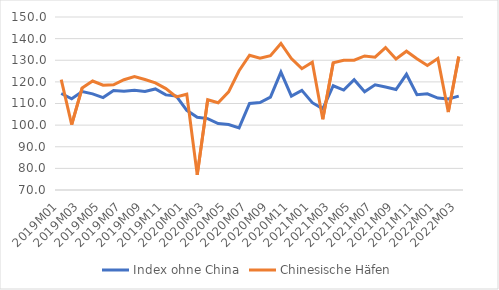
| Category | Index ohne China | Chinesische Häfen |
|---|---|---|
| 2019M01 | 114.623 | 121.055 |
| 2019M02 | 112.167 | 100.243 |
| 2019M03 | 115.491 | 117.222 |
| 2019M04 | 114.471 | 120.395 |
| 2019M05 | 112.755 | 118.453 |
| 2019M06 | 115.991 | 118.615 |
| 2019M07 | 115.713 | 120.972 |
| 2019M08 | 116.136 | 122.456 |
| 2019M09 | 115.568 | 121.083 |
| 2019M10 | 116.723 | 119.525 |
| 2019M11 | 113.984 | 116.902 |
| 2019M12 | 113.424 | 113.065 |
| 2020M01 | 106.849 | 114.303 |
| 2020M02 | 103.623 | 76.996 |
| 2020M03 | 103.019 | 111.745 |
| 2020M04 | 100.709 | 110.345 |
| 2020M05 | 100.278 | 115.373 |
| 2020M06 | 98.733 | 125.162 |
| 2020M07 | 110.053 | 132.331 |
| 2020M08 | 110.414 | 130.985 |
| 2020M09 | 112.922 | 132.092 |
| 2020M10 | 124.506 | 137.768 |
| 2020M11 | 113.407 | 130.804 |
| 2020M12 | 116.079 | 126.094 |
| 2021M01 | 110.373 | 129.138 |
| 2021M02 | 107.516 | 102.714 |
| 2021M03 | 118.214 | 128.817 |
| 2021M04 | 116.222 | 130.006 |
| 2021M05 | 120.982 | 130.043 |
| 2021M06 | 115.458 | 131.997 |
| 2021M07 | 118.653 | 131.44 |
| 2021M08 | 117.642 | 135.862 |
| 2021M09 | 116.451 | 130.546 |
| 2021M10 | 123.511 | 134.174 |
| 2021M11 | 114.042 | 130.697 |
| 2021M12 | 114.473 | 127.618 |
| 2022M01 | 112.534 | 130.781 |
| 2022M02 | 112.082 | 106.026 |
| 2022M03 | 113.418 | 131.686 |